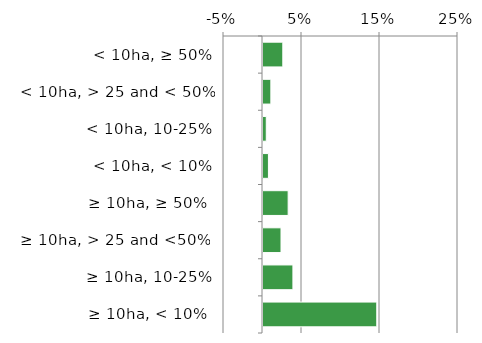
| Category | Non native |
|---|---|
|  ≥ 10ha, < 10%  | 0.147 |
|   ≥ 10ha, 10-25% | 0.04 |
|   ≥ 10ha, > 25 and <50%  | 0.024 |
|   ≥ 10ha, ≥ 50%  | 0.034 |
|  < 10ha, < 10% | 0.008 |
|  < 10ha, 10-25% | 0.005 |
|  < 10ha, > 25 and < 50% | 0.011 |
|  < 10ha, ≥ 50% | 0.027 |